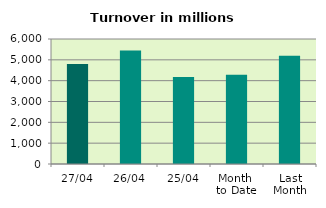
| Category | Series 0 |
|---|---|
| 27/04 | 4800.272 |
| 26/04 | 5449.521 |
| 25/04 | 4178.502 |
| Month 
to Date | 4279.032 |
| Last
Month | 5192.573 |